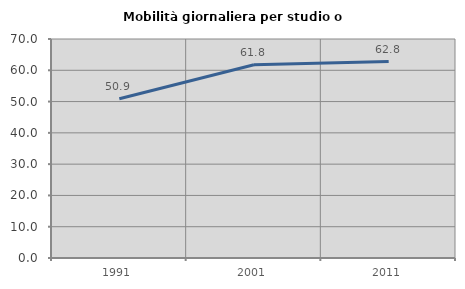
| Category | Mobilità giornaliera per studio o lavoro |
|---|---|
| 1991.0 | 50.917 |
| 2001.0 | 61.774 |
| 2011.0 | 62.791 |